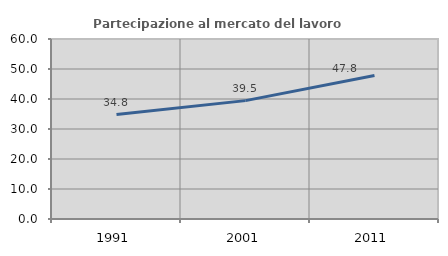
| Category | Partecipazione al mercato del lavoro  femminile |
|---|---|
| 1991.0 | 34.823 |
| 2001.0 | 39.461 |
| 2011.0 | 47.814 |